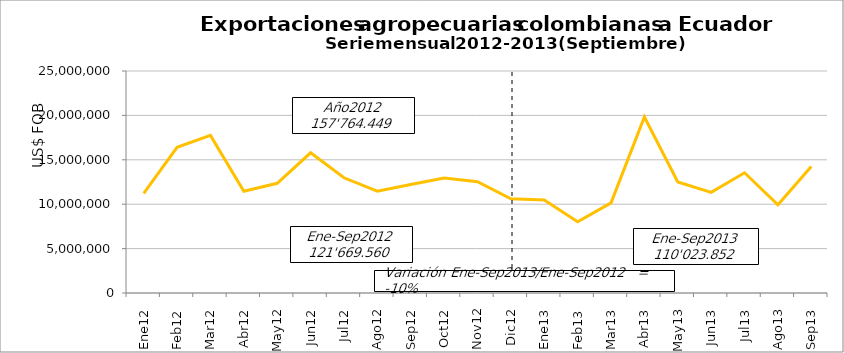
| Category | Series 0 |
|---|---|
| 0 | 11231504.1 |
| 1 | 16412430.11 |
| 2 | 17748959.71 |
| 3 | 11467486.78 |
| 4 | 12352749.79 |
| 5 | 15788192.64 |
| 6 | 12974469.77 |
| 7 | 11470930.29 |
| 8 | 12222837.03 |
| 9 | 12948150.25 |
| 10 | 12533793.18 |
| 11 | 10612945.03 |
| 12 | 10474520.71 |
| 13 | 8027333.7 |
| 14 | 10152946.14 |
| 15 | 19821458.72 |
| 16 | 12493803.03 |
| 17 | 11334080.03 |
| 18 | 13539520.96 |
| 19 | 9933547.88 |
| 20 | 14246640.69 |